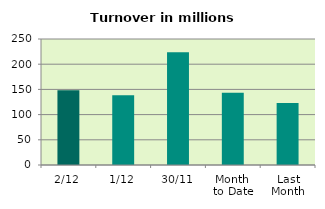
| Category | Series 0 |
|---|---|
| 2/12 | 148.363 |
| 1/12 | 138.462 |
| 30/11 | 223.482 |
| Month 
to Date | 143.412 |
| Last
Month | 122.873 |